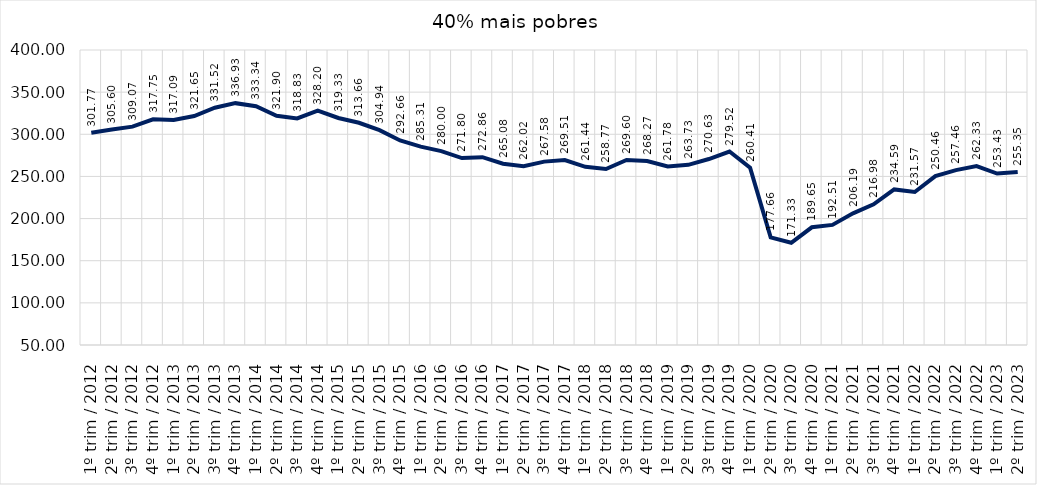
| Category | 40% mais pobres |
|---|---|
| 1º trim / 2012 | 301.77 |
| 2º trim / 2012 | 305.602 |
| 3º trim / 2012 | 309.069 |
| 4º trim / 2012 | 317.753 |
| 1º trim / 2013 | 317.094 |
| 2º trim / 2013 | 321.649 |
| 3º trim / 2013 | 331.521 |
| 4º trim / 2013 | 336.934 |
| 1º trim / 2014 | 333.344 |
| 2º trim / 2014 | 321.898 |
| 3º trim / 2014 | 318.834 |
| 4º trim / 2014 | 328.198 |
| 1º trim / 2015 | 319.326 |
| 2º trim / 2015 | 313.657 |
| 3º trim / 2015 | 304.939 |
| 4º trim / 2015 | 292.657 |
| 1º trim / 2016 | 285.308 |
| 2º trim / 2016 | 280 |
| 3º trim / 2016 | 271.796 |
| 4º trim / 2016 | 272.864 |
| 1º trim / 2017 | 265.08 |
| 2º trim / 2017 | 262.021 |
| 3º trim / 2017 | 267.579 |
| 4º trim / 2017 | 269.511 |
| 1º trim / 2018 | 261.443 |
| 2º trim / 2018 | 258.766 |
| 3º trim / 2018 | 269.597 |
| 4º trim / 2018 | 268.274 |
| 1º trim / 2019 | 261.779 |
| 2º trim / 2019 | 263.729 |
| 3º trim / 2019 | 270.632 |
| 4º trim / 2019 | 279.521 |
| 1º trim / 2020 | 260.411 |
| 2º trim / 2020 | 177.66 |
| 3º trim / 2020 | 171.333 |
| 4º trim / 2020 | 189.652 |
| 1º trim / 2021 | 192.511 |
| 2º trim / 2021 | 206.188 |
| 3º trim / 2021 | 216.978 |
| 4º trim / 2021 | 234.589 |
| 1º trim / 2022 | 231.569 |
| 2º trim / 2022 | 250.457 |
| 3º trim / 2022 | 257.457 |
| 4º trim / 2022 | 262.334 |
| 1º trim / 2023 | 253.434 |
| 2º trim / 2023 | 255.35 |